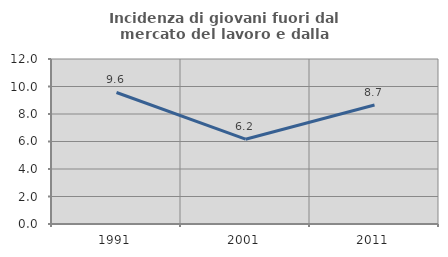
| Category | Incidenza di giovani fuori dal mercato del lavoro e dalla formazione  |
|---|---|
| 1991.0 | 9.565 |
| 2001.0 | 6.166 |
| 2011.0 | 8.651 |